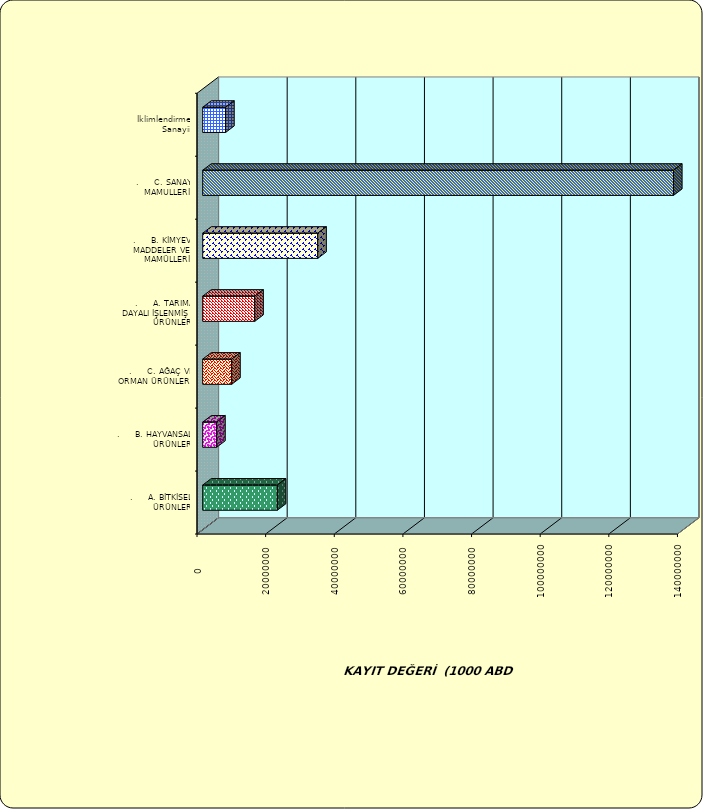
| Category | Series 0 |
|---|---|
| .     A. BİTKİSEL ÜRÜNLER | 21739679.762 |
| .     B. HAYVANSAL ÜRÜNLER | 4066045.855 |
| .     C. AĞAÇ VE ORMAN ÜRÜNLERİ | 8440766.375 |
| .     A. TARIMA DAYALI İŞLENMİŞ ÜRÜNLER | 15171292.631 |
| .     B. KİMYEVİ MADDELER VE MAMÜLLERİ | 33524626.388 |
| .     C. SANAYİ MAMULLERİ | 137184853.019 |
|  İklimlendirme Sanayii | 6680529.881 |